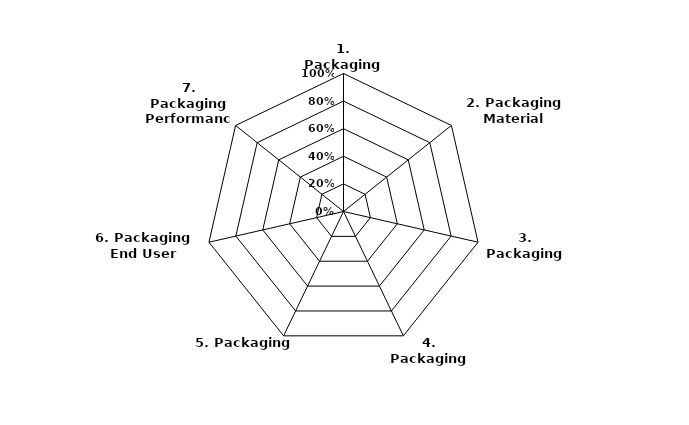
| Category | Series 0 |
|---|---|
| 1. Packaging Baseline | 0 |
| 2. Packaging Material Selection | 0 |
| 3. Packaging Supply Chain | 0 |
| 4. Packaging Minimisation | 0 |
| 5. Packaging Reuse | 0 |
| 6. Packaging End User Management | 0 |
| 7. Packaging Performance Reporting | 0 |